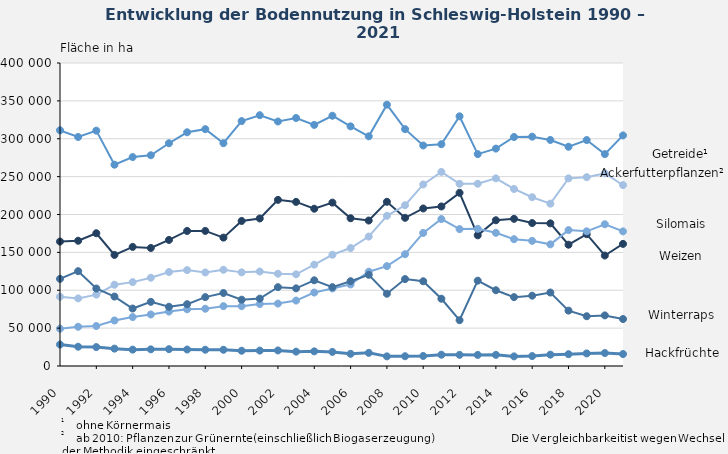
| Category | Getreide¹ | Weizen | Ackerfutterpflanzen² | Silomais | Winterraps | Hackfrüchte |
|---|---|---|---|---|---|---|
| 1990.0 | 311125 | 164285 | 91453 | 49276 | 115052 | 28341 |
| 1991.0 | 302327 | 165342 | 89224 | 51797 | 125200 | 25457 |
| 1992.0 | 310702 | 175267 | 94233 | 52792 | 102279 | 24977 |
| 1993.0 | 265745 | 146637 | 107232 | 60080 | 91673 | 22909 |
| 1994.0 | 275861 | 157210 | 110722 | 64618 | 75856 | 21603 |
| 1995.0 | 278206 | 155795 | 116532 | 68025 | 84698 | 21983 |
| 1996.0 | 294051 | 166428 | 124043 | 71829 | 78202 | 22231 |
| 1997.0 | 308528 | 178251 | 126580 | 74854 | 81564 | 21756 |
| 1998.0 | 312662 | 178334 | 123483 | 75604 | 90930 | 21488 |
| 1999.0 | 294161 | 169488 | 127006 | 79026 | 96378 | 21424 |
| 2000.0 | 323330 | 191461 | 123610 | 79032 | 87513 | 20127 |
| 2001.0 | 331096 | 194756 | 124700 | 81867 | 88978 | 20343 |
| 2002.0 | 322748 | 219333 | 121851 | 82399 | 104072 | 20517 |
| 2003.0 | 327381 | 216638 | 121012 | 86392 | 102495 | 18949 |
| 2004.0 | 318264 | 207605 | 133819 | 96954 | 113143 | 19337 |
| 2005.0 | 330363 | 215677 | 146840 | 102408 | 104109 | 18609 |
| 2006.0 | 316383 | 195077 | 155734 | 107717 | 111956 | 16062 |
| 2007.0 | 303230 | 192013 | 170853 | 124485 | 120386 | 17352 |
| 2008.0 | 345046 | 216782 | 198282 | 131833 | 95397 | 12712 |
| 2009.0 | 312656 | 195627 | 212173 | 147569 | 114733 | 12898 |
| 2010.0 | 291105 | 207956 | 239668 | 175669 | 111890 | 13222 |
| 2011.0 | 292800 | 210600 | 256200 | 194000 | 88800 | 14900 |
| 2012.0 | 329600 | 228600 | 240500 | 180700 | 60500 | 14700 |
| 2013.0 | 279700 | 172500 | 240600 | 181100 | 112600 | 14600 |
| 2014.0 | 287000 | 192400 | 247700 | 175800 | 100000 | 14700 |
| 2015.0 | 302300 | 194300 | 233700 | 167400 | 90900 | 12700 |
| 2016.0 | 302770 | 188694 | 222823 | 165217 | 92817 | 13115 |
| 2017.0 | 298400 | 188300 | 214300 | 160600 | 97000 | 15000 |
| 2018.0 | 289400 | 160100 | 247700 | 179400 | 73100 | 15600 |
| 2019.0 | 298300 | 174000 | 249300 | 177800 | 65700 | 16600 |
| 2020.0 | 279720 | 145849 | 254420 | 187112 | 66791 | 17103 |
| 2021.0 | 304400 | 161200 | 238800 | 177700 | 62000 | 15800 |